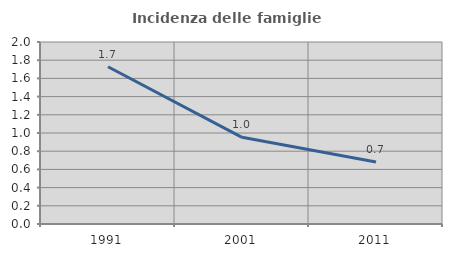
| Category | Incidenza delle famiglie numerose |
|---|---|
| 1991.0 | 1.728 |
| 2001.0 | 0.952 |
| 2011.0 | 0.682 |